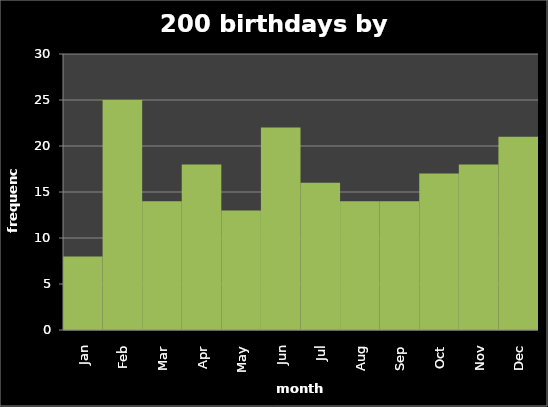
| Category | freq week |
|---|---|
| Jan | 8 |
| Feb | 25 |
| Mar | 14 |
| Apr | 18 |
| May | 13 |
| Jun | 22 |
| Jul | 16 |
| Aug | 14 |
| Sep | 14 |
| Oct | 17 |
| Nov | 18 |
| Dec | 21 |